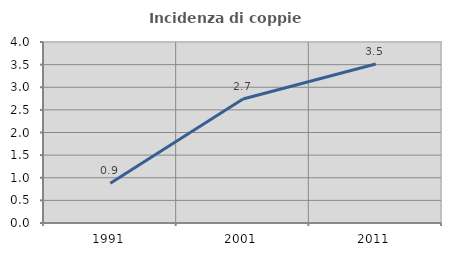
| Category | Incidenza di coppie miste |
|---|---|
| 1991.0 | 0.877 |
| 2001.0 | 2.74 |
| 2011.0 | 3.515 |